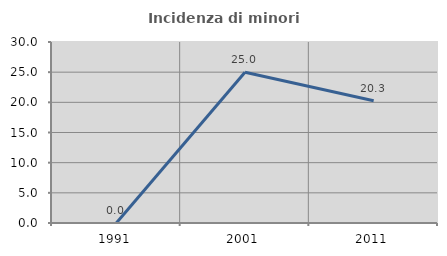
| Category | Incidenza di minori stranieri |
|---|---|
| 1991.0 | 0 |
| 2001.0 | 25 |
| 2011.0 | 20.253 |